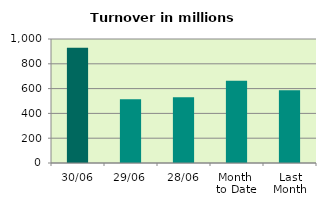
| Category | Series 0 |
|---|---|
| 30/06 | 930.062 |
| 29/06 | 513.268 |
| 28/06 | 529.909 |
| Month 
to Date | 663.186 |
| Last
Month | 587.249 |